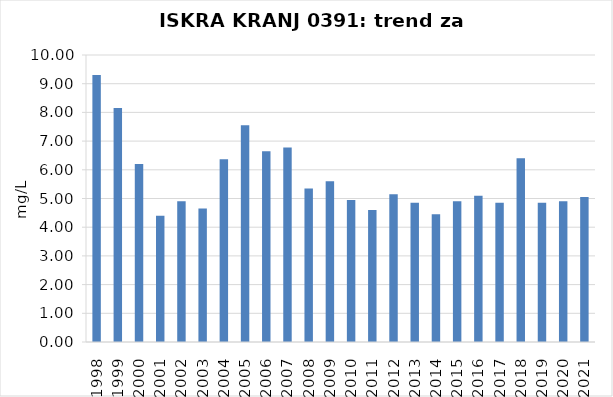
| Category | Vsota |
|---|---|
| 1998 | 9.3 |
| 1999 | 8.15 |
| 2000 | 6.2 |
| 2001 | 4.4 |
| 2002 | 4.9 |
| 2003 | 4.65 |
| 2004 | 6.367 |
| 2005 | 7.55 |
| 2006 | 6.65 |
| 2007 | 6.775 |
| 2008 | 5.35 |
| 2009 | 5.6 |
| 2010 | 4.95 |
| 2011 | 4.6 |
| 2012 | 5.15 |
| 2013 | 4.85 |
| 2014 | 4.45 |
| 2015 | 4.9 |
| 2016 | 5.1 |
| 2017 | 4.85 |
| 2018 | 6.4 |
| 2019 | 4.85 |
| 2020 | 4.9 |
| 2021 | 5.05 |